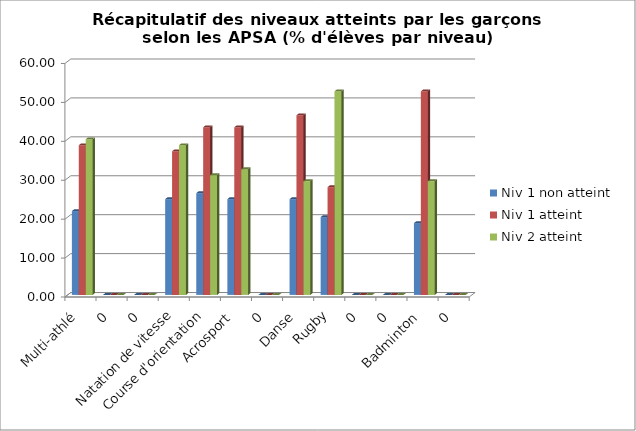
| Category | Niv 1 non atteint | Niv 1 atteint | Niv 2 atteint |
|---|---|---|---|
| Multi-athlé | 21.538 | 38.462 | 40 |
| 0 | 0 | 0 | 0 |
| 0 | 0 | 0 | 0 |
| Natation de vitesse | 24.615 | 36.923 | 38.462 |
| Course d'orientation | 26.154 | 43.077 | 30.769 |
| Acrosport | 24.615 | 43.077 | 32.308 |
| 0 | 0 | 0 | 0 |
| Danse | 24.615 | 46.154 | 29.231 |
| Rugby | 20 | 27.692 | 52.308 |
| 0 | 0 | 0 | 0 |
| 0 | 0 | 0 | 0 |
| Badminton | 18.462 | 52.308 | 29.231 |
| 0 | 0 | 0 | 0 |